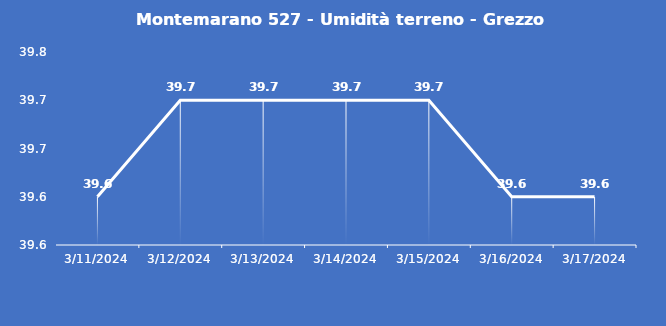
| Category | Montemarano 527 - Umidità terreno - Grezzo (%VWC) |
|---|---|
| 3/11/24 | 39.6 |
| 3/12/24 | 39.7 |
| 3/13/24 | 39.7 |
| 3/14/24 | 39.7 |
| 3/15/24 | 39.7 |
| 3/16/24 | 39.6 |
| 3/17/24 | 39.6 |